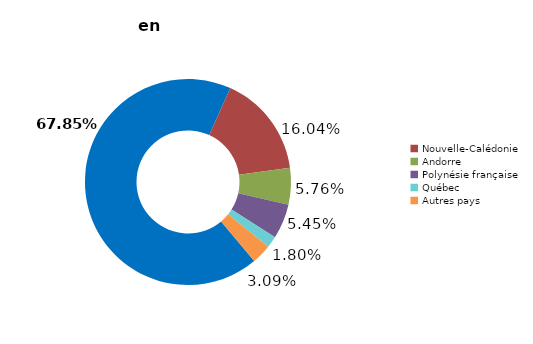
| Category | Series 0 |
|---|---|
| Algérie | 15886889.059 |
| Nouvelle-Calédonie | 3755110.67 |
| Andorre | 1348220.8 |
| Polynésie française | 1276960.07 |
| Québec | 422423.61 |
| Autres pays | 724262.55 |